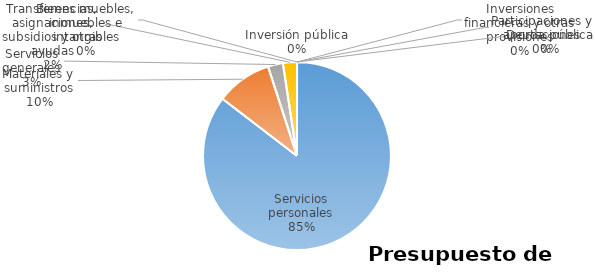
| Category | Series 0 | Series 1 | Series 2 | Series 3 | Series 4 | Series 5 |
|---|---|---|---|---|---|---|
| Servicios personales | 10066501 |  |  |  |  |  |
| Materiales y suministros | 1131768 |  |  |  |  |  |
| Servicios generales | 303804 |  |  |  |  |  |
| Transferencias, asignaciones, subsidios y otras ayudas | 283436 |  |  |  |  |  |
| Bienes muebles, inmuebles e intangibles | 0 |  |  |  |  |  |
| Inversión pública | 0 |  |  |  |  |  |
| Inversiones financieras y otras provisiones | 0 |  |  |  |  |  |
| Participaciones y aportaciones | 0 |  |  |  |  |  |
| Deuda pública | 0 |  |  |  |  |  |